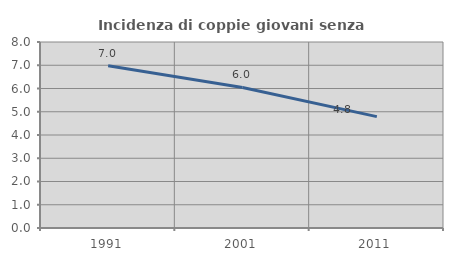
| Category | Incidenza di coppie giovani senza figli |
|---|---|
| 1991.0 | 6.977 |
| 2001.0 | 6.044 |
| 2011.0 | 4.79 |